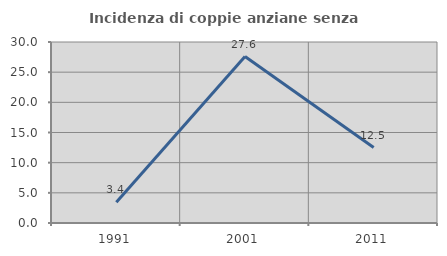
| Category | Incidenza di coppie anziane senza figli  |
|---|---|
| 1991.0 | 3.448 |
| 2001.0 | 27.586 |
| 2011.0 | 12.5 |